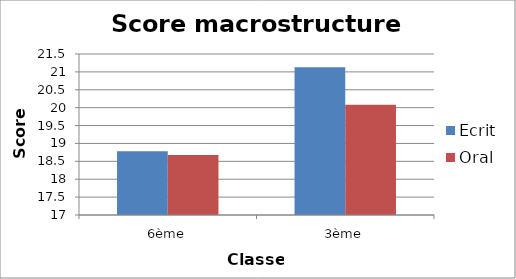
| Category | Ecrit | Oral |
|---|---|---|
| 6ème | 18.78 | 18.68 |
| 3ème | 21.13 | 20.08 |